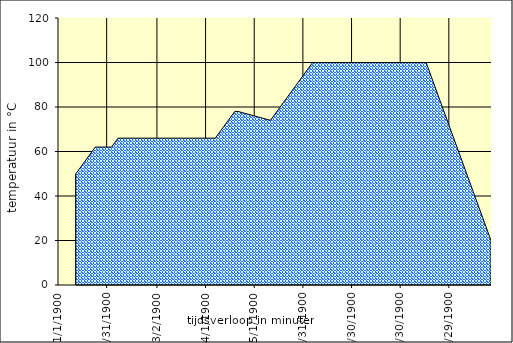
| Category | Maischschema grafisch |
|---|---|
| 0.0 | 38 |
| 0.0 | 38 |
| 12.0 | 50 |
| 12.0 | 50 |
| 24.0 | 62 |
| 34.0 | 62 |
| 38.0 | 66 |
| 98.0 | 66 |
| 110.0 | 78 |
| 112.0 | 78 |
| 112.0 | 78 |
| 132.0 | 74 |
| 158.0 | 100 |
| 228.0 | 100 |
| 228.0 | 100 |
| 268.0 | 20 |